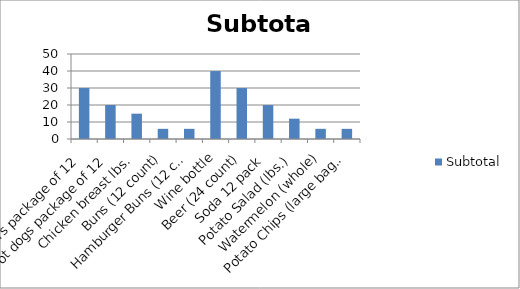
| Category | Subtotal |
|---|---|
| Burgers package of 12 | 29.98 |
| Hot dogs package of 12 | 19.98 |
| Chicken breast lbs. | 14.9 |
| Buns (12 count) | 5.98 |
| Hamburger Buns (12 count) | 5.98 |
| Wine bottle | 39.96 |
| Beer (24 count) | 29.98 |
| Soda 12 pack | 19.96 |
| Potato Salad (lbs.) | 11.96 |
| Watermelon (whole) | 5.99 |
| Potato Chips (large bags) | 5.97 |